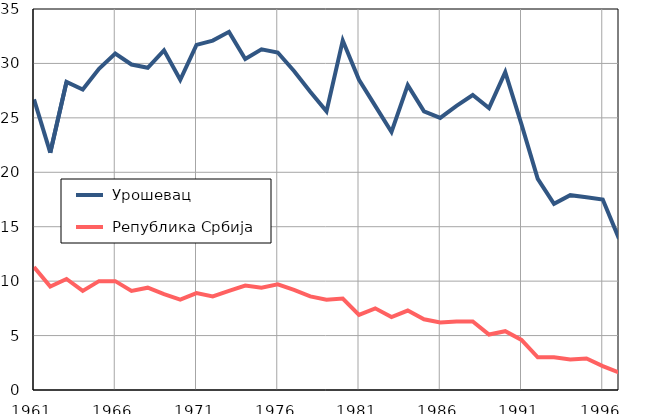
| Category |  Урошевац |  Република Србија |
|---|---|---|
| 1961.0 | 26.7 | 11.3 |
| 1962.0 | 21.8 | 9.5 |
| 1963.0 | 28.3 | 10.2 |
| 1964.0 | 27.6 | 9.1 |
| 1965.0 | 29.5 | 10 |
| 1966.0 | 30.9 | 10 |
| 1967.0 | 29.9 | 9.1 |
| 1968.0 | 29.6 | 9.4 |
| 1969.0 | 31.2 | 8.8 |
| 1970.0 | 28.5 | 8.3 |
| 1971.0 | 31.7 | 8.9 |
| 1972.0 | 32.1 | 8.6 |
| 1973.0 | 32.9 | 9.1 |
| 1974.0 | 30.4 | 9.6 |
| 1975.0 | 31.3 | 9.4 |
| 1976.0 | 31 | 9.7 |
| 1977.0 | 29.3 | 9.2 |
| 1978.0 | 27.4 | 8.6 |
| 1979.0 | 25.6 | 8.3 |
| 1980.0 | 32.1 | 8.4 |
| 1981.0 | 28.5 | 6.9 |
| 1982.0 | 26.1 | 7.5 |
| 1983.0 | 23.7 | 6.7 |
| 1984.0 | 28 | 7.3 |
| 1985.0 | 25.6 | 6.5 |
| 1986.0 | 25 | 6.2 |
| 1987.0 | 26.1 | 6.3 |
| 1988.0 | 27.1 | 6.3 |
| 1989.0 | 25.9 | 5.1 |
| 1990.0 | 29.2 | 5.4 |
| 1991.0 | 24.4 | 4.6 |
| 1992.0 | 19.4 | 3 |
| 1993.0 | 17.1 | 3 |
| 1994.0 | 17.9 | 2.8 |
| 1995.0 | 17.7 | 2.9 |
| 1996.0 | 17.5 | 2.2 |
| 1997.0 | 13.9 | 1.6 |